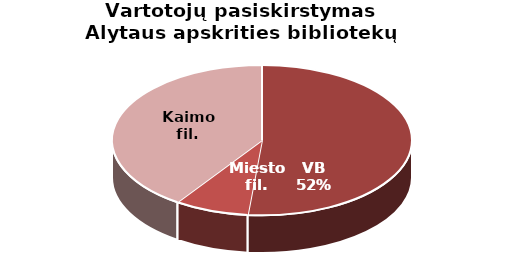
| Category | Vartotojų pasiskirstymas Alytaus apskrities bibliotekų padaliniuose |
|---|---|
| VB | 14901 |
| Miesto fil. | 2314 |
| Kaimo fil. | 11711 |